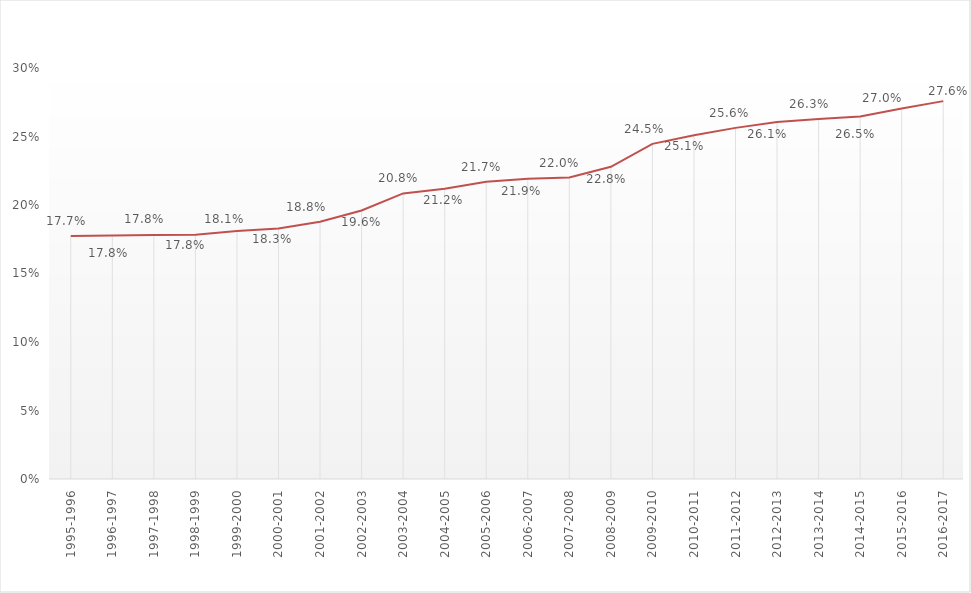
| Category | Series 0 | Series 1 | Series 2 |
|---|---|---|---|
| 1995-1996 |  | 0.177 |  |
| 1996-1997 |  | 0.178 |  |
| 1997-1998 |  | 0.178 |  |
| 1998-1999 |  | 0.178 |  |
| 1999-2000 |  | 0.181 |  |
| 2000-2001 |  | 0.183 |  |
| 2001-2002 |  | 0.188 |  |
| 2002-2003 |  | 0.196 |  |
| 2003-2004 |  | 0.208 |  |
| 2004-2005 |  | 0.212 |  |
| 2005-2006 |  | 0.217 |  |
| 2006-2007 |  | 0.219 |  |
| 2007-2008 |  | 0.22 |  |
| 2008-2009 |  | 0.228 |  |
| 2009-2010 |  | 0.245 |  |
| 2010-2011 |  | 0.251 |  |
| 2011-2012 |  | 0.256 |  |
| 2012-2013 |  | 0.261 |  |
| 2013-2014 |  | 0.263 |  |
| 2014-2015 |  | 0.265 |  |
| 2015-2016 |  | 0.27 |  |
| 2016-2017 |  | 0.276 |  |